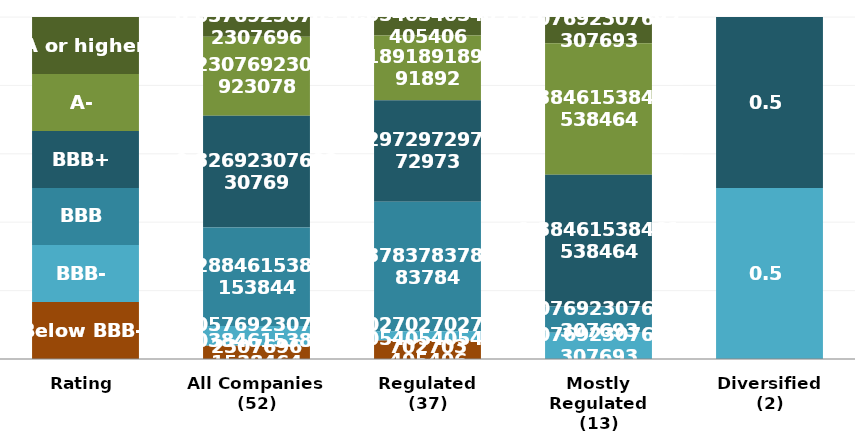
| Category | A or higher | A- | BBB+ | BBB | BBB- | Below BBB- |
|---|---|---|---|---|---|---|
| Rating | 1 | 1 | 1 | 1 | 1 | 1 |
| All Companies
(52) | 3 | 12 | 17 | 15 | 3 | 2 |
| Regulated
(37) | 2 | 7 | 11 | 14 | 1 | 2 |
| Mostly Regulated
(13) | 1 | 5 | 5 | 1 | 1 | 0 |
| Diversified
(2) | 0 | 0 | 1 | 0 | 1 | 0 |